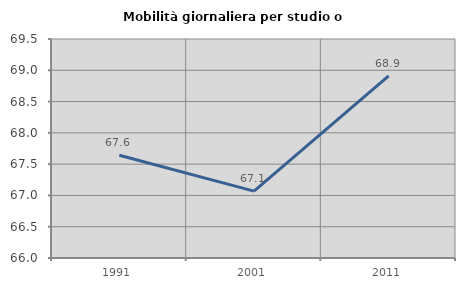
| Category | Mobilità giornaliera per studio o lavoro |
|---|---|
| 1991.0 | 67.642 |
| 2001.0 | 67.068 |
| 2011.0 | 68.909 |